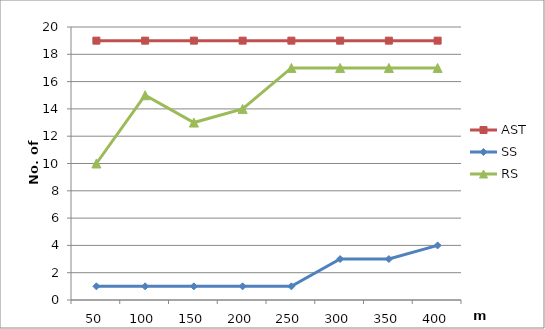
| Category | AST | SS | RS |
|---|---|---|---|
| 50.0 | 19 | 1 | 10 |
| 100.0 | 19 | 1 | 15 |
| 150.0 | 19 | 1 | 13 |
| 200.0 | 19 | 1 | 14 |
| 250.0 | 19 | 1 | 17 |
| 300.0 | 19 | 3 | 17 |
| 350.0 | 19 | 3 | 17 |
| 400.0 | 19 | 4 | 17 |